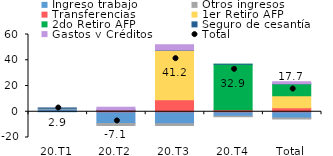
| Category | Ingreso trabajo | Otros ingresos | Transferencias | 1er Retiro AFP | 2do Retiro AFP | Seguro de cesantía | Gastos y Créditos |
|---|---|---|---|---|---|---|---|
| 20.T1 | 2.173 | 0.603 | 0 | 0 | 0 | 0.116 | 0 |
| 20.T2 | -9.074 | -1.584 | 1.377 | 0 | 0 | 0.145 | 1.997 |
| 20.T3 | -9.32 | -1.453 | 9.252 | 38.577 | 0 | 0.128 | 4.064 |
| 20.T4 | -3.504 | -0.457 | 1.568 | 0 | 35.234 | 0.102 | 0 |
| Total | -4.943 | -0.725 | 3.026 | 9.474 | 9.205 | 0.123 | 1.497 |